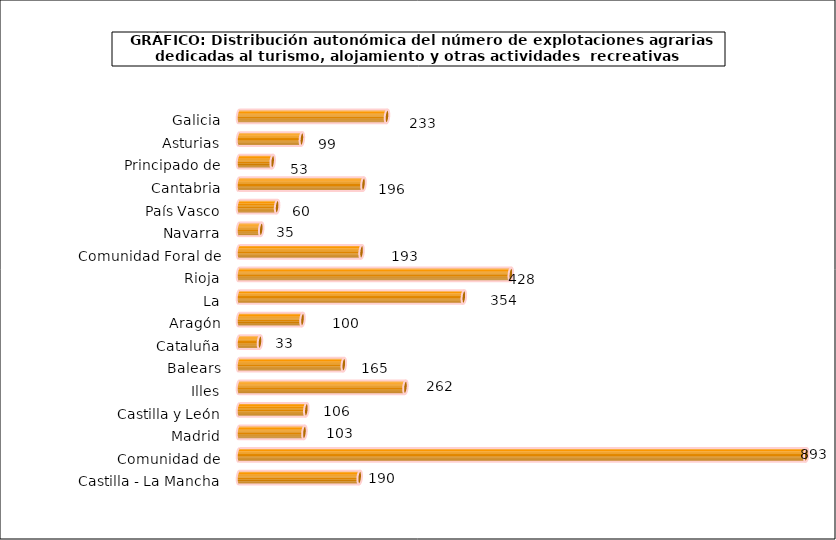
| Category | num. Explotaciones |
|---|---|
| 0 | 233 |
| 1 | 99 |
| 2 | 53 |
| 3 | 196 |
| 4 | 60 |
| 5 | 35 |
| 6 | 193 |
| 7 | 428 |
| 8 | 354 |
| 9 | 100 |
| 10 | 33 |
| 11 | 165 |
| 12 | 262 |
| 13 | 106 |
| 14 | 103 |
| 15 | 893 |
| 16 | 190 |